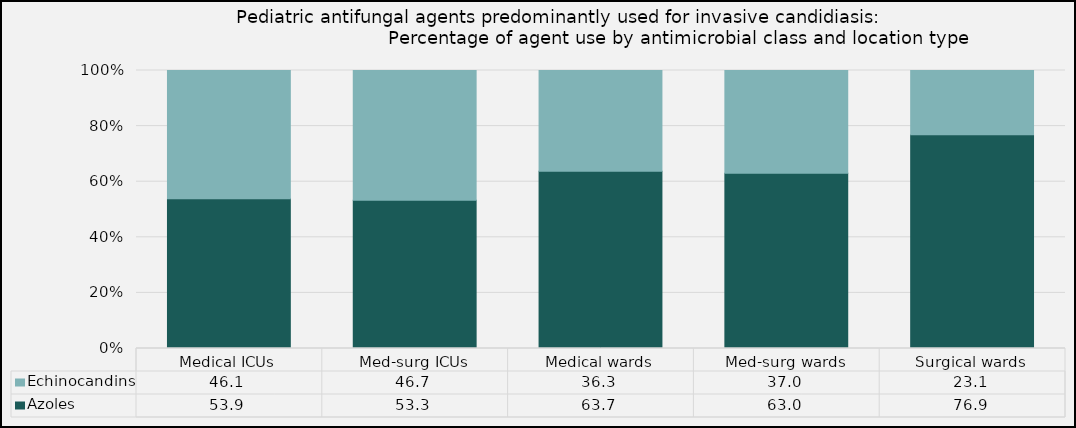
| Category | Azoles | Echinocandins |
|---|---|---|
| Medical ICUs | 53.86 | 46.14 |
| Med-surg ICUs | 53.29 | 46.71 |
| Medical wards | 63.74 | 36.26 |
| Med-surg wards | 63.02 | 36.98 |
| Surgical wards | 76.88 | 23.12 |